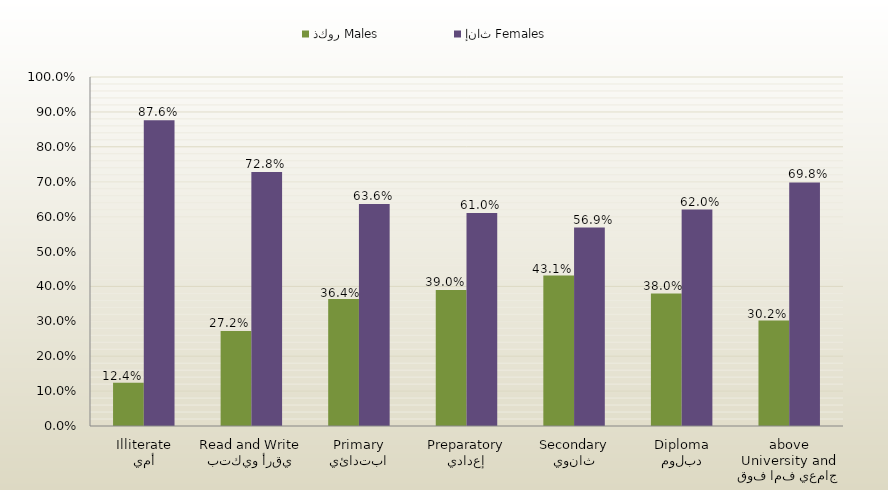
| Category | ذكور Males | إناث Females |
|---|---|---|
| أمي
Illiterate | 0.124 | 0.876 |
| يقرأ ويكتب
Read and Write | 0.272 | 0.728 |
| ابتدائي
Primary | 0.364 | 0.636 |
| إعدادي
Preparatory | 0.39 | 0.61 |
| ثانوي
Secondary | 0.431 | 0.569 |
| دبلوم
Diploma | 0.38 | 0.62 |
| جامعي فما فوق
University and above | 0.302 | 0.698 |